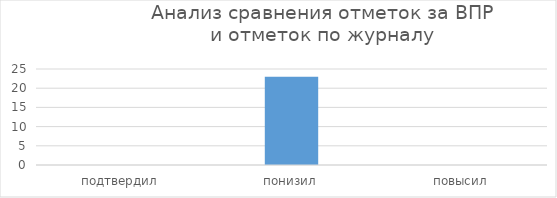
| Category | Series 0 |
|---|---|
| подтвердил | 0 |
| понизил | 23 |
| повысил | 0 |